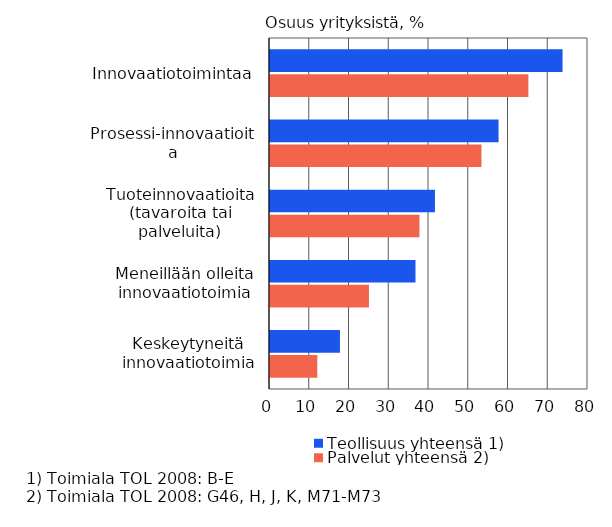
| Category | Teollisuus yhteensä 1) | Palvelut yhteensä 2) |
|---|---|---|
| Innovaatiotoimintaa | 73.6 | 65 |
| Prosessi-innovaatioita | 57.5 | 53.2 |
| Tuoteinnovaatioita (tavaroita tai palveluita) | 41.5 | 37.6 |
| Meneillään olleita innovaatiotoimia | 36.6 | 24.9 |
| Keskeytyneitä innovaatiotoimia | 17.6 | 11.9 |